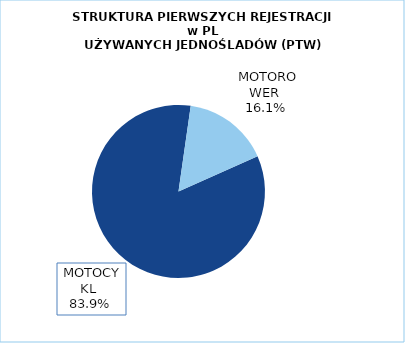
| Category | RAZEM |
|---|---|
|  MOTOCYKL  | 0.839 |
|  MOTOROWER  | 0.161 |